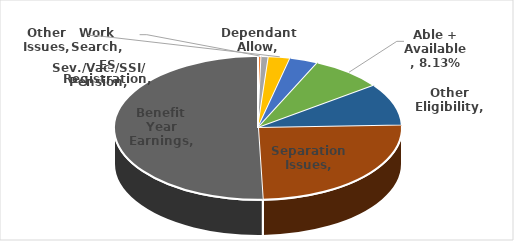
| Category | Series 0 |
|---|---|
| Dependant Allow | 0 |
| Work Search | 0.004 |
| ES Registration | 0.008 |
| Other Issues | 0.024 |
| Sev./Vac./SSI/ Pension | 0.032 |
| Able + Available | 0.081 |
| Other Eligibility | 0.095 |
| Separation Issues | 0.25 |
| Benefit Year Earnings | 0.505 |